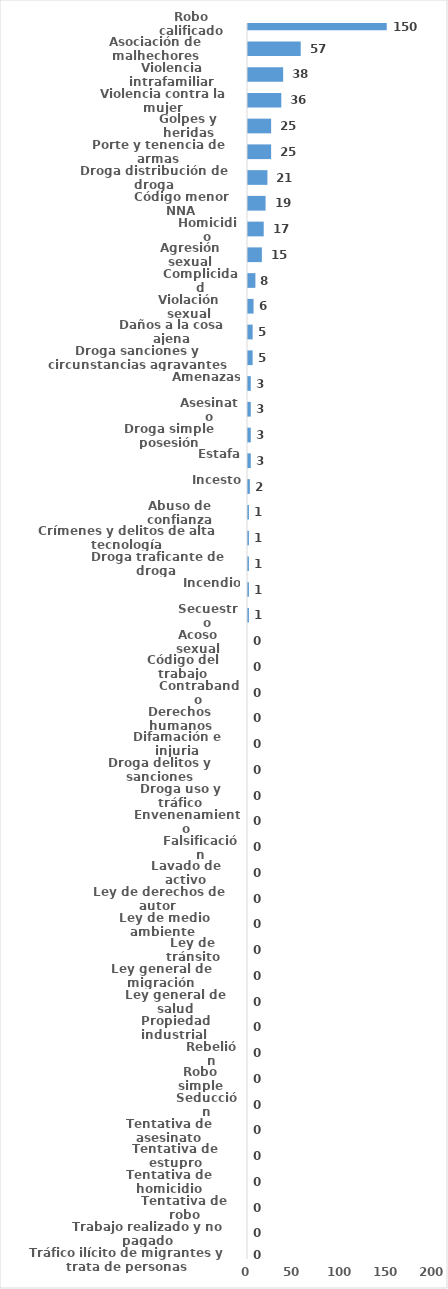
| Category | Series 0 |
|---|---|
| Robo calificado | 150 |
| Asociación de malhechores | 57 |
| Violencia intrafamiliar | 38 |
| Violencia contra la mujer | 36 |
| Golpes y heridas | 25 |
| Porte y tenencia de armas | 25 |
| Droga distribución de droga | 21 |
| Código menor NNA | 19 |
| Homicidio | 17 |
| Agresión sexual | 15 |
| Complicidad | 8 |
| Violación sexual | 6 |
| Daños a la cosa ajena | 5 |
| Droga sanciones y circunstancias agravantes | 5 |
| Amenazas | 3 |
| Asesinato | 3 |
| Droga simple posesión | 3 |
| Estafa | 3 |
| Incesto | 2 |
| Abuso de confianza | 1 |
| Crímenes y delitos de alta tecnología | 1 |
| Droga traficante de droga  | 1 |
| Incendio | 1 |
| Secuestro | 1 |
| Acoso sexual | 0 |
| Código del trabajo | 0 |
| Contrabando | 0 |
| Derechos humanos | 0 |
| Difamación e injuria | 0 |
| Droga delitos y sanciones | 0 |
| Droga uso y tráfico | 0 |
| Envenenamiento | 0 |
| Falsificación | 0 |
| Lavado de activo | 0 |
| Ley de derechos de autor  | 0 |
| Ley de medio ambiente  | 0 |
| Ley de tránsito | 0 |
| Ley general de migración | 0 |
| Ley general de salud | 0 |
| Propiedad industrial  | 0 |
| Rebelión | 0 |
| Robo simple | 0 |
| Seducción | 0 |
| Tentativa de asesinato | 0 |
| Tentativa de estupro | 0 |
| Tentativa de homicidio | 0 |
| Tentativa de robo | 0 |
| Trabajo realizado y no pagado | 0 |
| Tráfico ilícito de migrantes y trata de personas | 0 |